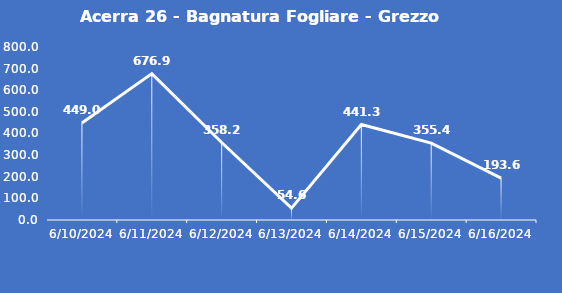
| Category | Acerra 26 - Bagnatura Fogliare - Grezzo (min) |
|---|---|
| 6/10/24 | 449 |
| 6/11/24 | 676.9 |
| 6/12/24 | 358.2 |
| 6/13/24 | 54.6 |
| 6/14/24 | 441.3 |
| 6/15/24 | 355.4 |
| 6/16/24 | 193.6 |